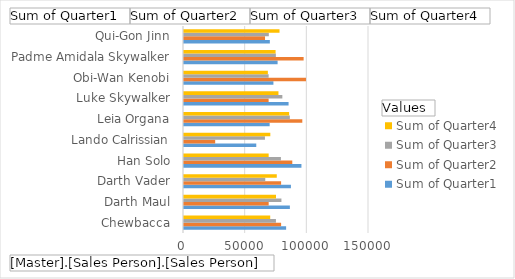
| Category | Sum of Quarter1 | Sum of Quarter2 | Sum of Quarter3 | Sum of Quarter4 |
|---|---|---|---|---|
| Chewbacca | 82802 | 78742 | 74541 | 69899 |
| Darth Maul | 85845 | 68656 | 78989 | 74592 |
| Darth Vader | 86700 | 78725 | 65885 | 75229 |
| Han Solo | 95220 | 87805 | 78582 | 68652 |
| Lando Calrissian | 58595 | 25289 | 65633 | 69987 |
| Leia Organa | 69450 | 95921 | 85826 | 85235 |
| Luke Skywalker | 84784 | 68622 | 79741 | 76584 |
| Obi-Wan Kenobi | 72500 | 98904 | 68632 | 67992 |
| Padme Amidala Skywalker | 75891 | 96992 | 74494 | 74256 |
| Qui-Gon Jinn | 69605 | 65693 | 68778 | 77443 |